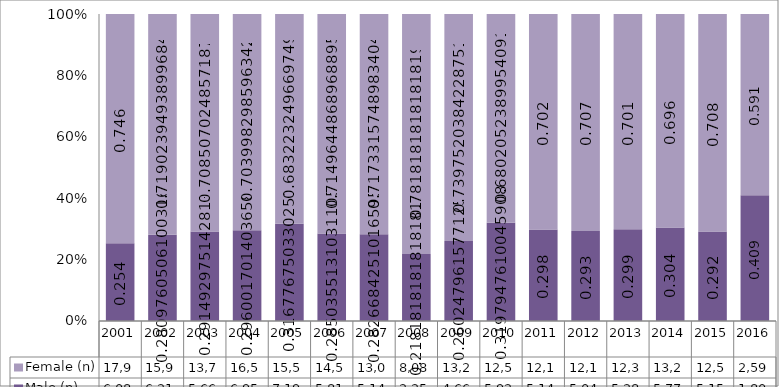
| Category | Male (n) | Female (n) |
|---|---|---|
| 2001.0 | 6089 | 17918 |
| 2002.0 | 6218 | 15912 |
| 2003.0 | 5664 | 13767 |
| 2004.0 | 6959 | 16551 |
| 2005.0 | 7194 | 15516 |
| 2006.0 | 5819 | 14596 |
| 2007.0 | 5144 | 13054 |
| 2008.0 | 2256 | 8084 |
| 2009.0 | 4660 | 13246 |
| 2010.0 | 5921 | 12594 |
| 2011.0 | 5146 | 12140 |
| 2012.0 | 5042 | 12155 |
| 2013.0 | 5280 | 12375 |
| 2014.0 | 5778 | 13206 |
| 2015.0 | 5154 | 12523 |
| 2016.0 | 1800 | 2597 |